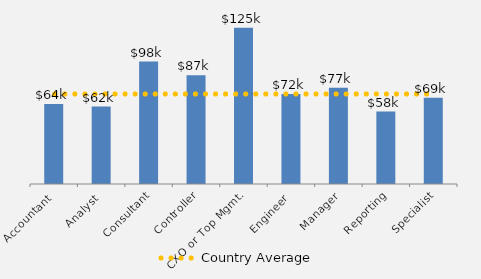
| Category | Series 0 |
|---|---|
| Accountant | 64 |
| Analyst | 62 |
| Consultant | 98 |
| Controller | 87 |
| CXO or Top Mgmt. | 125 |
| Engineer | 72 |
| Manager | 77 |
| Reporting | 58 |
| Specialist | 69 |